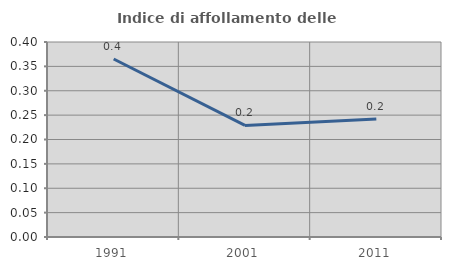
| Category | Indice di affollamento delle abitazioni  |
|---|---|
| 1991.0 | 0.365 |
| 2001.0 | 0.229 |
| 2011.0 | 0.242 |